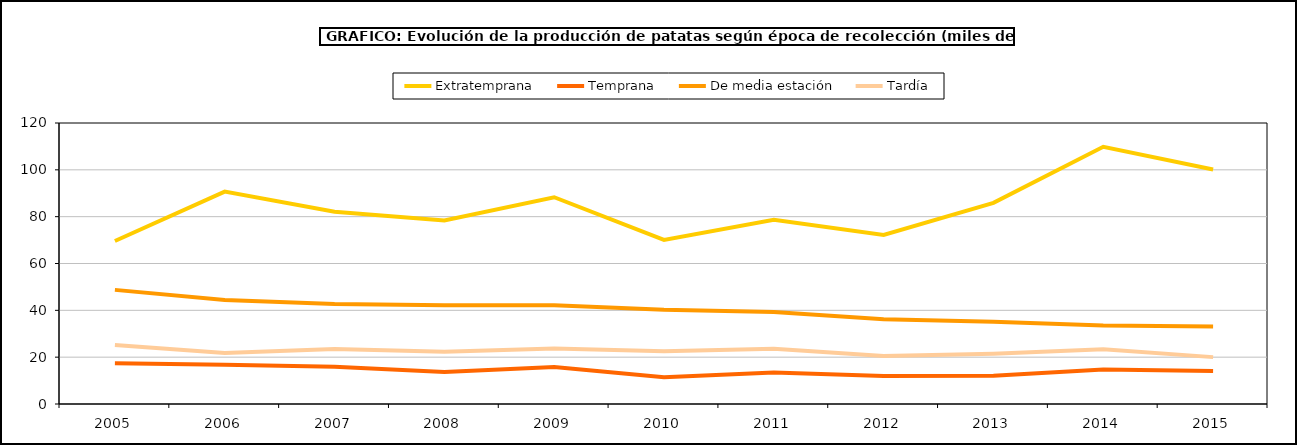
| Category | Extratemprana | Temprana | De media estación | Tardía |
|---|---|---|---|---|
| 2005.0 | 69.624 | 17.435 | 48.734 | 25.155 |
| 2006.0 | 90.691 | 16.814 | 44.395 | 21.83 |
| 2007.0 | 82.104 | 15.925 | 42.735 | 23.526 |
| 2008.0 | 78.383 | 13.629 | 42.134 | 22.278 |
| 2009.0 | 88.296 | 15.804 | 42.188 | 23.661 |
| 2010.0 | 70.07 | 11.444 | 40.198 | 22.492 |
| 2011.0 | 78.631 | 13.439 | 39.332 | 23.623 |
| 2012.0 | 72.219 | 12.004 | 36.224 | 20.486 |
| 2013.0 | 85.916 | 12.091 | 35.096 | 21.424 |
| 2014.0 | 109.861 | 14.725 | 33.547 | 23.388 |
| 2015.0 | 100.12 | 14.085 | 33.109 | 20.017 |